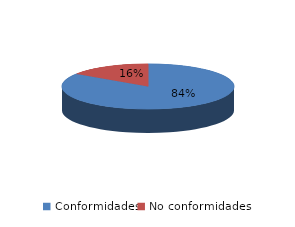
| Category | Series 0 |
|---|---|
| Conformidades | 1118 |
| No conformidades | 206 |